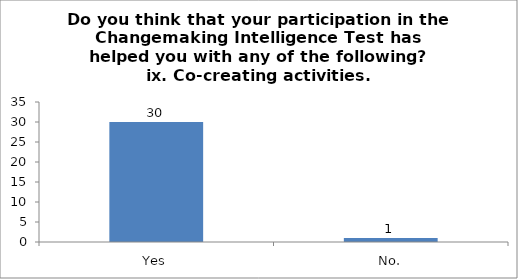
| Category | Do you think that your participation in the Changemaking Intelligence Test has helped you with any of the following?
ix. Co-creating activities. |
|---|---|
| Yes | 30 |
| No. | 1 |